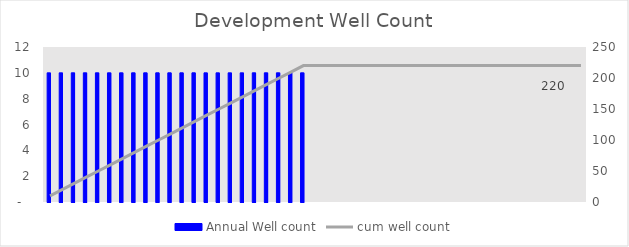
| Category | Annual Well count |
|---|---|
| 2023.0 | 10 |
| 2024.0 | 10 |
| 2025.0 | 10 |
| 2026.0 | 10 |
| 2027.0 | 10 |
| 2028.0 | 10 |
| 2029.0 | 10 |
| 2030.0 | 10 |
| 2031.0 | 10 |
| 2032.0 | 10 |
| 2033.0 | 10 |
| 2034.0 | 10 |
| 2035.0 | 10 |
| 2036.0 | 10 |
| 2037.0 | 10 |
| 2038.0 | 10 |
| 2039.0 | 10 |
| 2040.0 | 10 |
| 2041.0 | 10 |
| 2042.0 | 10 |
| 2043.0 | 10 |
| 2044.0 | 10 |
| 2045.0 | 0 |
| 2046.0 | 0 |
| 2047.0 | 0 |
| 2048.0 | 0 |
| 2049.0 | 0 |
| 2050.0 | 0 |
| 2051.0 | 0 |
| 2052.0 | 0 |
| 2053.0 | 0 |
| 2054.0 | 0 |
| 2055.0 | 0 |
| 2056.0 | 0 |
| 2057.0 | 0 |
| 2058.0 | 0 |
| 2059.0 | 0 |
| 2060.0 | 0 |
| 2061.0 | 0 |
| 2062.0 | 0 |
| 2063.0 | 0 |
| 2064.0 | 0 |
| 2065.0 | 0 |
| 2066.0 | 0 |
| 2067.0 | 0 |